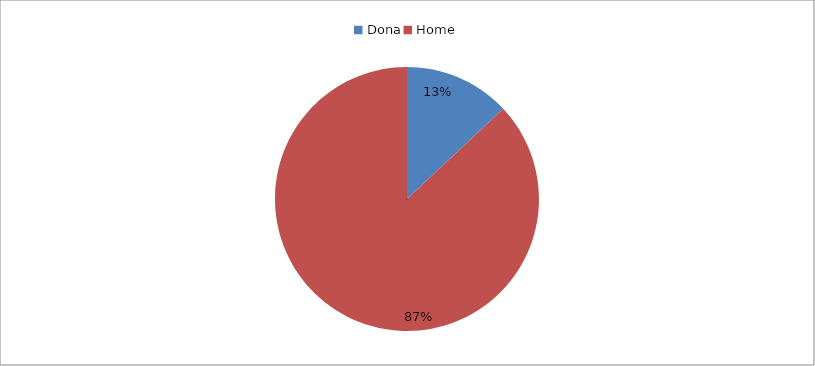
| Category | Series 0 | Series 1 |
|---|---|---|
| Dona | 0.13 |  |
| Home | 0.87 |  |